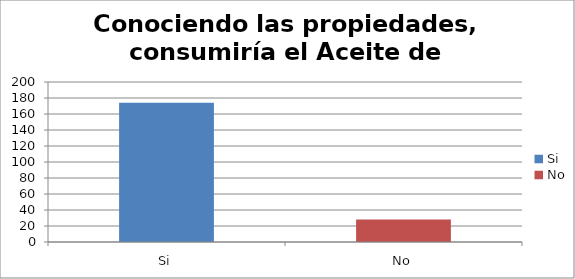
| Category | Conociendo las propiedades, consuniría el Aceite de Jengibre |
|---|---|
| Si | 174 |
| No | 28 |